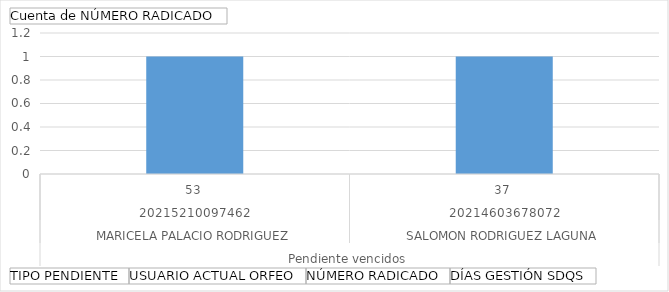
| Category | Total |
|---|---|
| 0 | 1 |
| 1 | 1 |